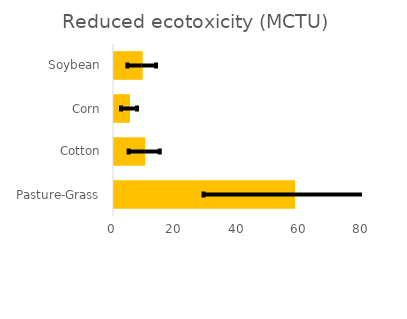
| Category | Reduced ecotoxicity (MCTU) |
|---|---|
| Pasture-Grass | 58.178 |
| Cotton | 10.014 |
| Corn | 5.15 |
| Soybean | 9.212 |